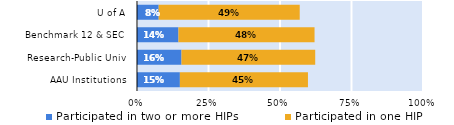
| Category | Participated in two or more HIPs | Participated in one HIP |
|---|---|---|
| AAU Institutions | 0.15 | 0.448 |
| Research-Public Univ | 0.156 | 0.468 |
| Benchmark 12 & SEC | 0.145 | 0.476 |
| U of A | 0.076 | 0.493 |